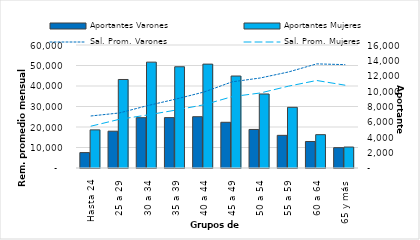
| Category | Aportantes Varones | Aportantes Mujeres |
|---|---|---|
| Hasta 24 | 2004 | 4959 |
| 25 a 29 | 4788 | 11513 |
| 30 a 34 | 6543 | 13771 |
| 35 a 39 | 6553 | 13170 |
| 40 a 44 | 6672 | 13513 |
| 45 a 49 | 5947 | 11965 |
| 50 a 54 | 5013 | 9628 |
| 55 a 59 | 4247 | 7894 |
| 60 a 64 | 3449 | 4336 |
| 65 y más | 2646 | 2727 |